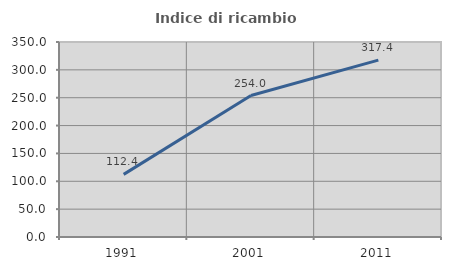
| Category | Indice di ricambio occupazionale  |
|---|---|
| 1991.0 | 112.371 |
| 2001.0 | 253.968 |
| 2011.0 | 317.391 |